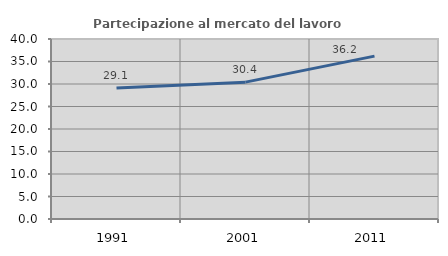
| Category | Partecipazione al mercato del lavoro  femminile |
|---|---|
| 1991.0 | 29.115 |
| 2001.0 | 30.411 |
| 2011.0 | 36.196 |